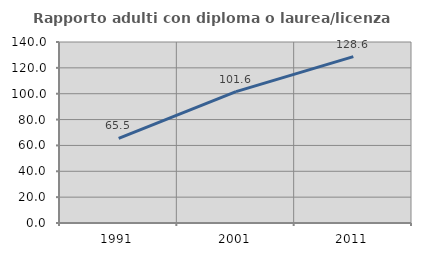
| Category | Rapporto adulti con diploma o laurea/licenza media  |
|---|---|
| 1991.0 | 65.523 |
| 2001.0 | 101.596 |
| 2011.0 | 128.646 |